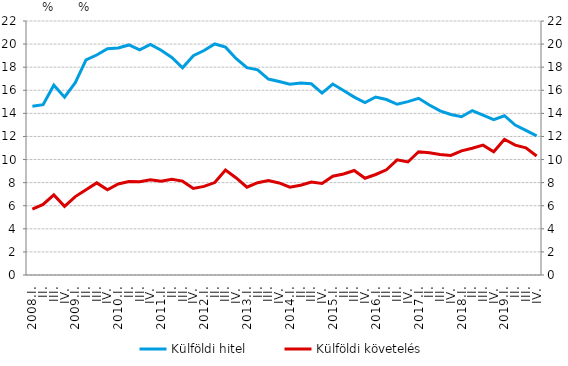
| Category | Külföldi hitel |
|---|---|
| 2008.I. | 14.619 |
| II. | 14.756 |
| III. | 16.442 |
| IV. | 15.406 |
| 2009.I. | 16.657 |
| II. | 18.63 |
| III. | 19.055 |
| IV. | 19.597 |
| 2010.I. | 19.662 |
| II. | 19.926 |
| III. | 19.498 |
| IV. | 19.973 |
| 2011.I. | 19.469 |
| II. | 18.84 |
| III. | 17.946 |
| IV. | 18.989 |
| 2012.I. | 19.445 |
| II. | 20.01 |
| III. | 19.733 |
| IV. | 18.738 |
| 2013.I. | 17.955 |
| II. | 17.766 |
| III. | 16.973 |
| IV. | 16.756 |
| 2014.I. | 16.532 |
| II. | 16.628 |
| III. | 16.564 |
| IV. | 15.758 |
| 2015.I. | 16.54 |
| II. | 15.979 |
| III. | 15.408 |
| IV. | 14.939 |
| 2016.I. | 15.415 |
| II. | 15.199 |
| III. | 14.787 |
| IV. | 15.021 |
| 2017.I. | 15.308 |
| II. | 14.723 |
| III. | 14.211 |
| IV. | 13.9 |
| 2018.I. | 13.711 |
| II. | 14.242 |
| III. | 13.838 |
| IV. | 13.458 |
| 2019.I. | 13.796 |
| II. | 12.985 |
| III. | 12.521 |
| IV. | 12.054 |